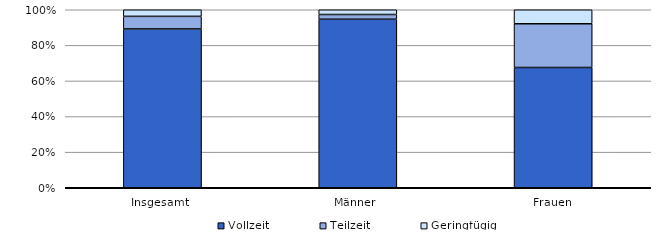
| Category | Vollzeit | Teilzeit | Geringfügig |
|---|---|---|---|
| Insgesamt  | 89.227 | 7.062 | 3.711 |
| Männer  | 94.679 | 2.657 | 2.664 |
| Frauen | 67.568 | 24.56 | 7.872 |